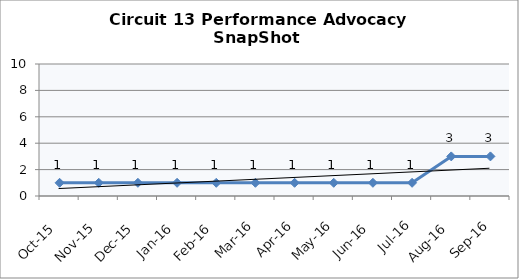
| Category | Circuit 13 |
|---|---|
| Oct-15 | 1 |
| Nov-15 | 1 |
| Dec-15 | 1 |
| Jan-16 | 1 |
| Feb-16 | 1 |
| Mar-16 | 1 |
| Apr-16 | 1 |
| May-16 | 1 |
| Jun-16 | 1 |
| Jul-16 | 1 |
| Aug-16 | 3 |
| Sep-16 | 3 |